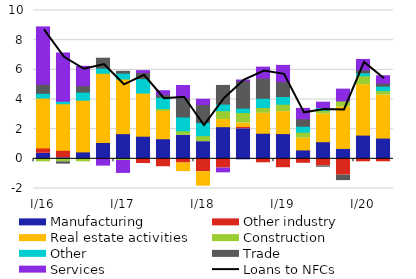
| Category | Manufacturing | Other industry | Real estate activities | Construction | Other | Trade | Services |
|---|---|---|---|---|---|---|---|
| I/16 | 0.372 | 0.362 | 3.359 | -0.2 | 0.325 | 0.608 | 3.869 |
| II | 0.072 | 0.502 | 3.138 | -0.2 | 0.17 | -0.089 | 3.256 |
| III | 0.454 | 0.013 | 3.483 | -0.2 | 0.549 | 0.432 | 1.308 |
| IV | 1.093 | 0.006 | 4.578 | 0.1 | 0.338 | 0.669 | -0.424 |
| I/17 | 1.697 | -0.007 | 3.685 | -0.1 | 0.393 | 0.129 | -0.807 |
| II | 1.525 | -0.317 | 2.819 | 0.1 | 0.964 | 0.413 | 0.125 |
| III | 1.353 | -0.534 | 1.841 | 0.2 | 0.758 | 0.173 | 0.267 |
| IV | 1.588 | -0.285 | -0.51 | 0.3 | 0.934 | 1.291 | 0.831 |
| I/18 | 1.158 | -0.865 | -0.911 | 0.4 | 0.888 | 1.216 | 0.357 |
| II | 2.167 | -0.624 | 0.481 | 0.6 | 0.442 | 1.258 | -0.254 |
| III | 2.025 | 0.159 | 0.235 | 0.7 | 0.299 | 1.841 | 0.054 |
| IV | 1.724 | -0.266 | 1.343 | 0.4 | 0.615 | 1.358 | 0.742 |
| I/19 | 1.7 | -0.6 | 1.481 | 0.5 | 0.519 | 1 | 1.1 |
| II | 0.6 | -0.3 | 0.8 | 0.4 | 0.4 | 0.5 | 0.7 |
| III | 1.154 | -0.475 | 1.869 | 0.244 | 0.181 | -0.024 | 0.372 |
| IV | 0.7 | -1.1 | 2.8 | 0.4 | 0 | -0.3 | 0.8 |
| I/20 | 1.6 | -0.2 | 3.4 | 0.6 | 0.2 | 0.2 | 0.7 |
| II | 1.4 | -0.2 | 2.9 | 0.3 | 0.3 | 0.2 | 0.5 |